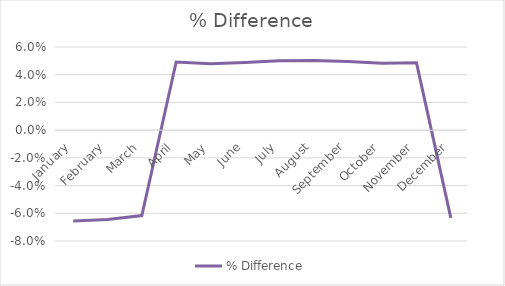
| Category | % Difference |
|---|---|
| January | -0.066 |
| February | -0.065 |
| March | -0.062 |
| April | 0.049 |
| May | 0.048 |
| June | 0.049 |
| July | 0.05 |
| August | 0.05 |
| September | 0.05 |
| October | 0.048 |
| November | 0.049 |
| December | -0.063 |